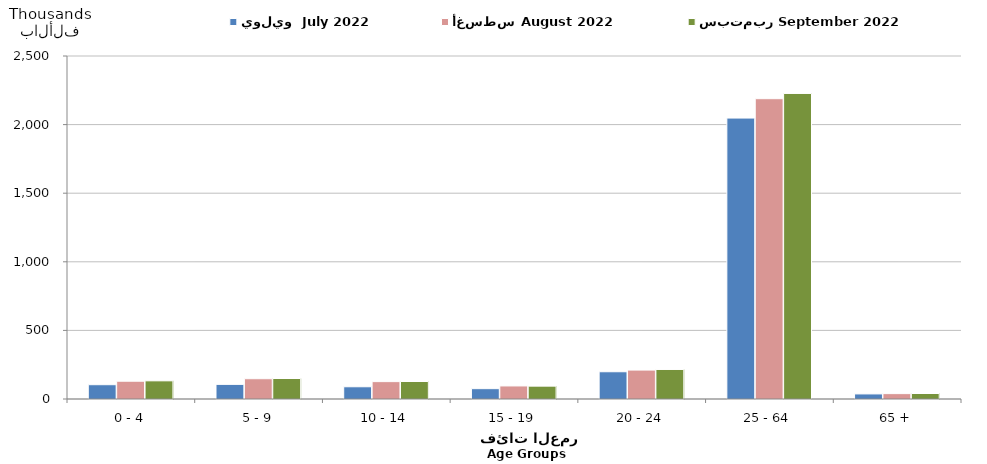
| Category | يوليو  July 2022 | أغسطس August 2022  | سبتمبر September 2022  |
|---|---|---|---|
| 0 - 4 | 104180 | 129573 | 132405 |
| 5 - 9 | 106559 | 147769 | 149344 |
| 10 - 14 | 89155 | 126540 | 127516 |
| 15 - 19 | 75315 | 95146 | 93638 |
| 20 - 24 | 198555 | 210866 | 215166 |
| 25 - 64 | 2047557 | 2188814 | 2226921 |
| 65 + | 36990 | 39092 | 40039 |